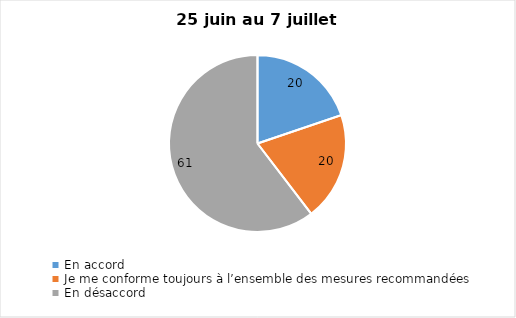
| Category | Series 0 |
|---|---|
| En accord | 20 |
| Je me conforme toujours à l’ensemble des mesures recommandées | 20 |
| En désaccord | 61 |